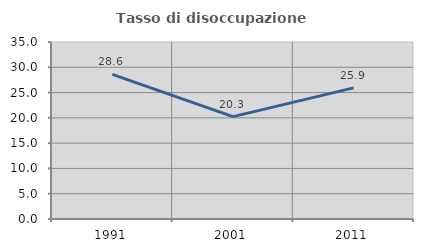
| Category | Tasso di disoccupazione giovanile  |
|---|---|
| 1991.0 | 28.597 |
| 2001.0 | 20.251 |
| 2011.0 | 25.929 |